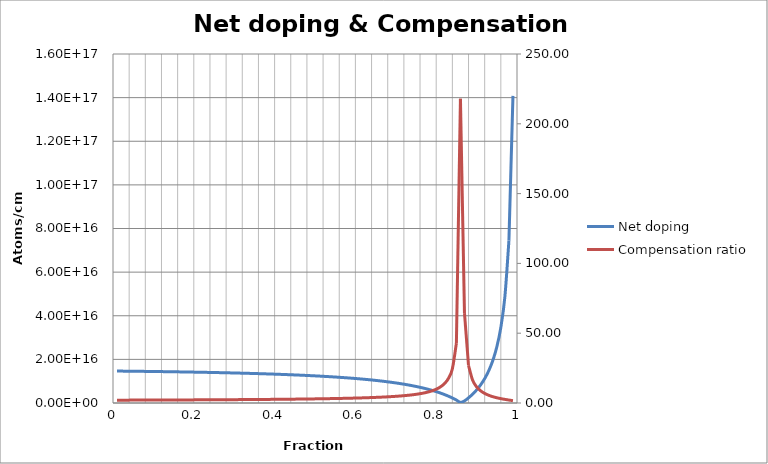
| Category | Net doping |
|---|---|
| 0.01 | 14642282910888736 |
| 0.02 | 14622573832828344 |
| 0.03 | 14602328662927590 |
| 0.04 | 14581530064142214 |
| 0.05 | 14560159973745864 |
| 0.06 | 14538199565382180 |
| 0.07 | 14515629208718254 |
| 0.08 | 14492428426520632 |
| 0.09 | 14468575848959858 |
| 0.1 | 14444049164932604 |
| 0.11 | 14418825070171856 |
| 0.12 | 14392879211895148 |
| 0.13 | 14366186129718544 |
| 0.14 | 14338719192538980 |
| 0.15 | 14310450531060418 |
| 0.16 | 14281350965609044 |
| 0.17 | 14251389928848980 |
| 0.18 | 14220535382973448 |
| 0.19 | 14188753730904676 |
| 0.2 | 14156009720990724 |
| 0.21 | 14122266344636428 |
| 0.22 | 14087484726249292 |
| 0.23 | 14051624004818488 |
| 0.24 | 14014641206374792 |
| 0.25 | 13976491106500866 |
| 0.26 | 13937126081973956 |
| 0.27 | 13896495950524398 |
| 0.28 | 13854547797583312 |
| 0.29 | 13811225788768884 |
| 0.3 | 13766470966721078 |
| 0.31 | 13720221030737444 |
| 0.32 | 13672410097484890 |
| 0.33 | 13622968440861638 |
| 0.34 | 13571822208855460 |
| 0.35 | 13518893114986320 |
| 0.36 | 13464098101627106 |
| 0.37 | 13407348972161366 |
| 0.38 | 13348551988554544 |
| 0.39 | 13287607430477460 |
| 0.4 | 13224409111619360 |
| 0.41 | 13158843848251552 |
| 0.42 | 13090790874439114 |
| 0.43 | 13020121197532488 |
| 0.44 | 12946696886684998 |
| 0.45 | 12870370286115418 |
| 0.46 | 12790983143640572 |
| 0.47 | 12708365643611474 |
| 0.48 | 12622335331760152 |
| 0.49 | 12532695917558194 |
| 0.5 | 12439235937447754 |
| 0.51 | 12341727259664596 |
| 0.52 | 12239923408249088 |
| 0.53 | 12133557680135328 |
| 0.54 | 12022341024796152 |
| 0.55 | 11905959650651344 |
| 0.56 | 11784072316125634 |
| 0.57 | 11656307255635848 |
| 0.58 | 11522258681593000 |
| 0.59 | 11381482792348512 |
| 0.6 | 11233493202416582 |
| 0.61 | 11077755694655842 |
| 0.62 | 10913682173612372 |
| 0.63 | 10740623673903382 |
| 0.64 | 10557862246046352 |
| 0.65 | 10364601502803490 |
| 0.66 | 10159955559663226 |
| 0.67 | 9942936040539886 |
| 0.68 | 9712436740158668 |
| 0.69 | 9467215432549502 |
| 0.7 | 9205872183332022 |
| 0.71 | 8926823352080656 |
| 0.72 | 8628270246252704 |
| 0.73 | 8308161090726516 |
| 0.74 | 7964144579802344 |
| 0.75 | 7593512742826848 |
| 0.76 | 7193130124406888 |
| 0.77 | 6759345273437080 |
| 0.78 | 6287879129971288 |
| 0.79 | 5773682911386004 |
| 0.8 | 5210755247145200 |
| 0.81 | 4591904154064180 |
| 0.82 | 3908433279278940 |
| 0.83 | 3149722523718428 |
| 0.84 | 2302658791160528 |
| 0.85 | 1350849931373800 |
| 0.86 | 273518229229848 |
| 0.87 | 956091385942784 |
| 0.88 | 2373058526033232 |
| 0.89 | 4024348060886364 |
| 0.9 | 5974392831504828 |
| 0.91 | 8314192685725044 |
| 0.92 | 11176847723465604 |
| 0.93 | 14765613304051892 |
| 0.94 | 19408257334760956 |
| 0.95 | 25672319098110888 |
| 0.96 | 34640859911943192 |
| 0.97 | 48695686766705136 |
| 0.98 | 74429089031963456 |
| 0.99 | 140785267849282624 |